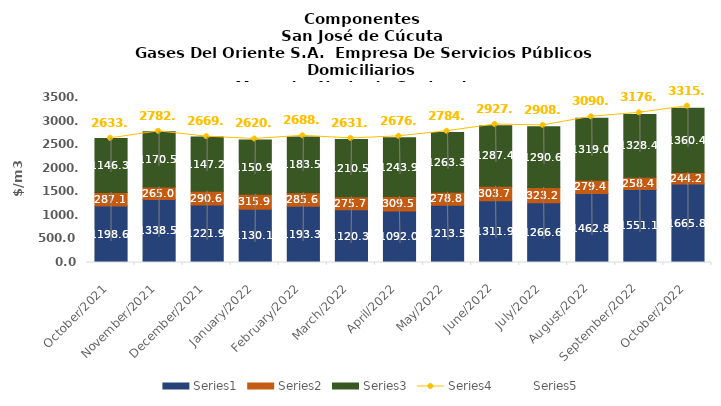
| Category | Series 0 | Series 1 | Series 2 |
|---|---|---|---|
| 2021-10-01 | 1198.61 | 287.14 | 1146.3 |
| 2021-11-01 | 1338.51 | 265.04 | 1170.48 |
| 2021-12-01 | 1221.86 | 290.55 | 1147.22 |
| 2022-01-01 | 1130.08 | 315.87 | 1150.94 |
| 2022-02-01 | 1193.32 | 285.55 | 1183.5 |
| 2022-03-01 | 1120.29 | 275.73 | 1210.53 |
| 2022-04-01 | 1092 | 309.51 | 1243.93 |
| 2022-05-01 | 1213.53 | 278.75 | 1263.34 |
| 2022-06-01 | 1311.85 | 303.7 | 1287.39 |
| 2022-07-01 | 1266.62 | 323.18 | 1290.61 |
| 2022-08-01 | 1462.83 | 279.37 | 1319 |
| 2022-09-01 | 1551.06 | 258.41 | 1328.42 |
| 2022-10-01 | 1665.75 | 244.23 | 1360.41 |